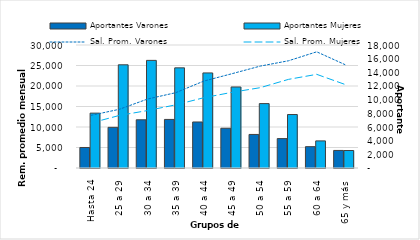
| Category | Aportantes Varones | Aportantes Mujeres |
|---|---|---|
| 0 | 3002 | 8029 |
| 1 | 5950 | 15101 |
| 2 | 7055 | 15749 |
| 3 | 7108 | 14657 |
| 4 | 6736 | 13913 |
| 5 | 5819 | 11857 |
| 6 | 4910 | 9425 |
| 7 | 4302 | 7825 |
| 8 | 3122 | 3965 |
| 9 | 2568 | 2560 |